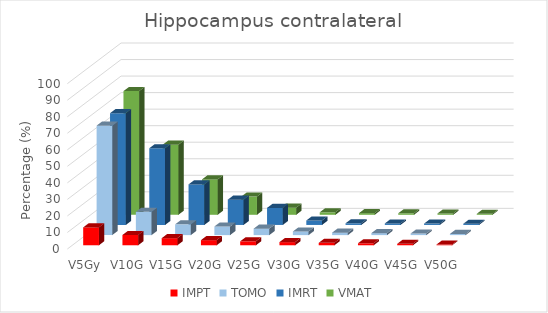
| Category | IMPT | TOMO | IMRT | VMAT |
|---|---|---|---|---|
| V5Gy | 10.8 | 66.2 | 67.6 | 74.8 |
| V10Gy | 6.2 | 14.1 | 46.4 | 42.4 |
| V15Gy | 4.3 | 6.5 | 24.5 | 21.4 |
| V20Gy | 3.1 | 5.2 | 15.3 | 11 |
| V25Gy | 2.4 | 3.9 | 10.3 | 4.3 |
| V30Gy | 1.9 | 2.2 | 2.7 | 1.5 |
| V35Gy | 1.5 | 1.5 | 1 | 1 |
| V40Gy | 1.2 | 1.2 | 0.91 | 0.91 |
| V45Gy | 0.9 | 0.95 | 0.83 | 0.8 |
| V50Gy | 0.44 | 0.71 | 0.72 | 0.6 |